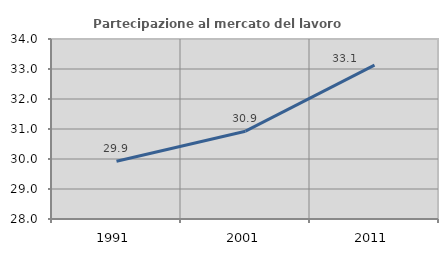
| Category | Partecipazione al mercato del lavoro  femminile |
|---|---|
| 1991.0 | 29.925 |
| 2001.0 | 30.927 |
| 2011.0 | 33.129 |